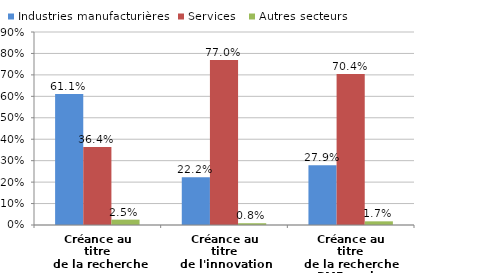
| Category | Industries manufacturières | Services | Autres secteurs |
|---|---|---|---|
| Créance au titre
 de la recherche | 0.611 | 0.364 | 0.025 |
| Créance au titre
de l'innovation | 0.222 | 0.77 | 0.008 |
| Créance au titre
de la recherche
PME seules | 0.279 | 0.704 | 0.017 |